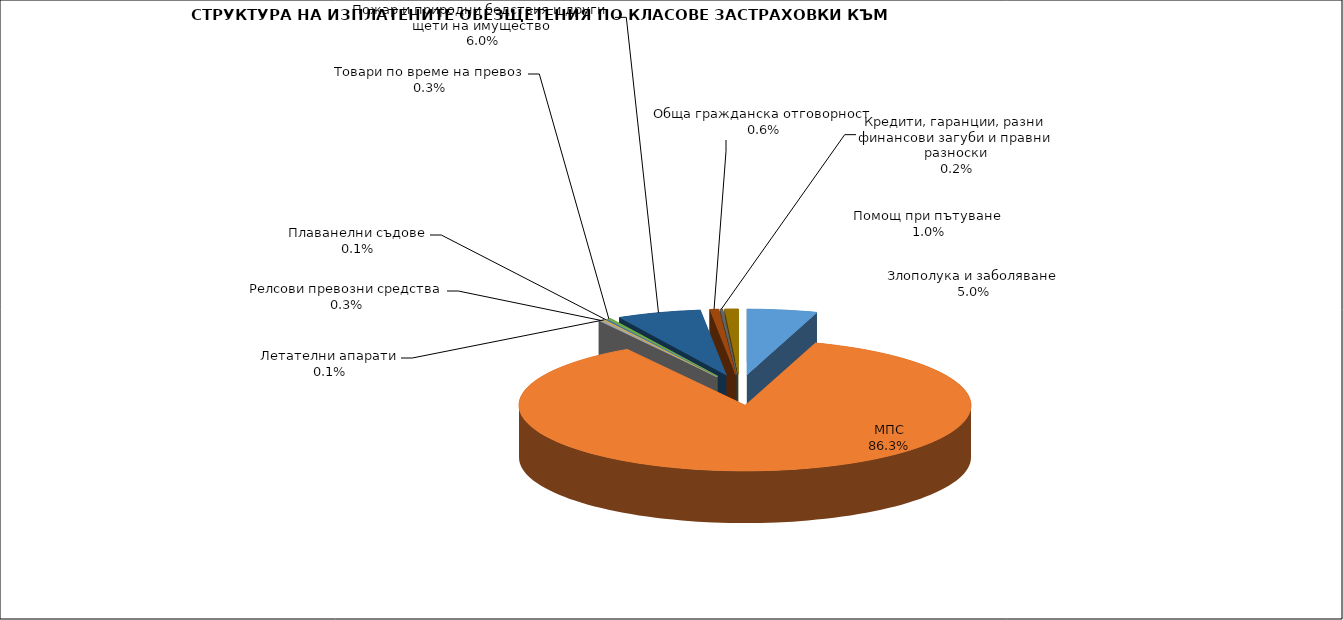
| Category | Series 0 |
|---|---|
| Злополука и заболяване | 0.05 |
| МПС | 0.863 |
| Релсови превозни средства | 0.003 |
| Летателни апарати | 0.001 |
| Плаванелни съдове | 0.001 |
| Товари по време на превоз | 0.003 |
| Пожар и природни бедствия и други щети на имущество | 0.06 |
| Обща гражданска отговорност | 0.006 |
| Кредити, гаранции, разни финансови загуби и правни разноски | 0.002 |
| Помощ при пътуване | 0.01 |